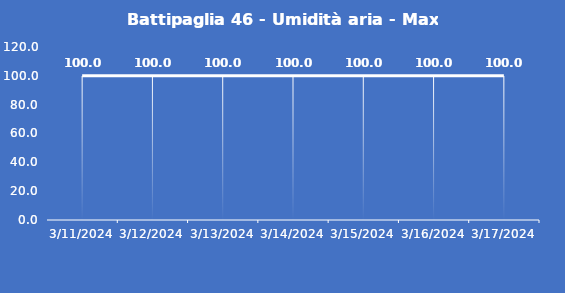
| Category | Battipaglia 46 - Umidità aria - Max (%) |
|---|---|
| 3/11/24 | 100 |
| 3/12/24 | 100 |
| 3/13/24 | 100 |
| 3/14/24 | 100 |
| 3/15/24 | 100 |
| 3/16/24 | 100 |
| 3/17/24 | 100 |